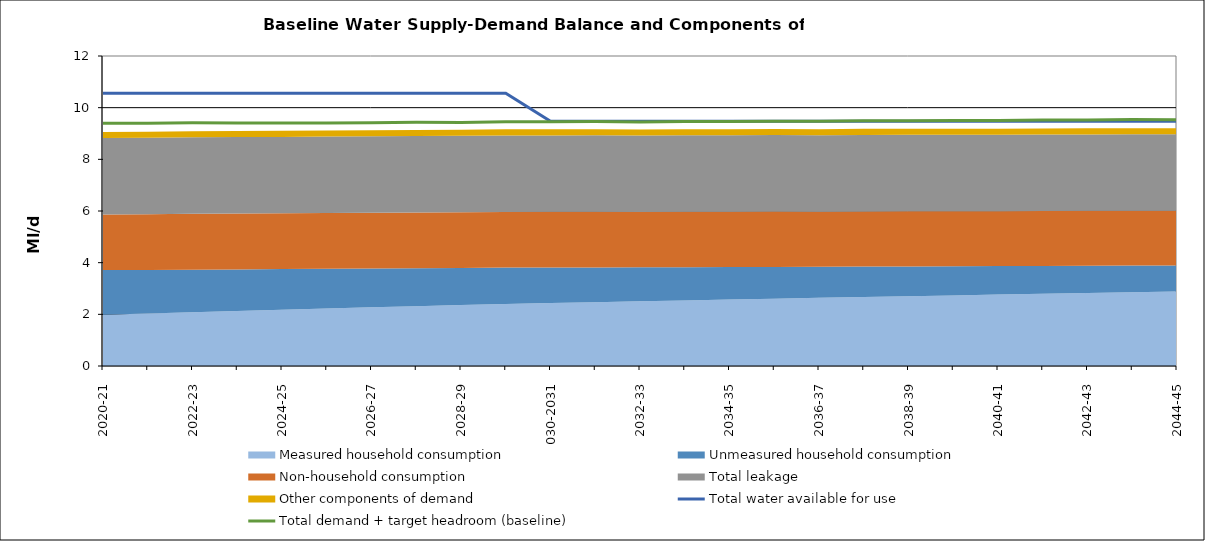
| Category | Total water available for use | Total demand + target headroom (baseline) |
|---|---|---|
| 0 | 10.56 | 9.399 |
| 1 | 10.56 | 9.398 |
| 2 | 10.56 | 9.412 |
| 3 | 10.56 | 9.404 |
| 4 | 10.56 | 9.409 |
| 5 | 10.56 | 9.411 |
| 6 | 10.56 | 9.415 |
| 7 | 10.56 | 9.432 |
| 8 | 10.56 | 9.427 |
| 9 | 10.56 | 9.453 |
| 10 | 9.47 | 9.457 |
| 11 | 9.47 | 9.46 |
| 12 | 9.47 | 9.441 |
| 13 | 9.47 | 9.462 |
| 14 | 9.47 | 9.466 |
| 15 | 9.47 | 9.476 |
| 16 | 9.47 | 9.476 |
| 17 | 9.47 | 9.492 |
| 18 | 9.47 | 9.495 |
| 19 | 9.47 | 9.507 |
| 20 | 9.47 | 9.502 |
| 21 | 9.47 | 9.52 |
| 22 | 9.47 | 9.526 |
| 23 | 9.47 | 9.541 |
| 24 | 9.47 | 9.536 |